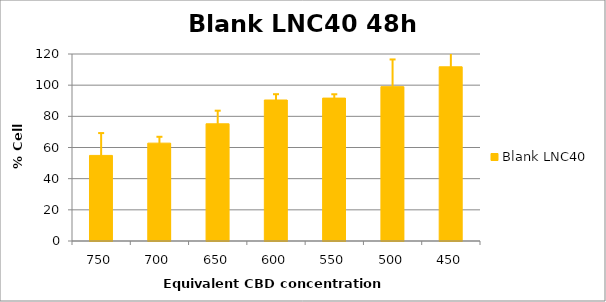
| Category | Blank LNC40 |
|---|---|
| 750.0 | 54.925 |
| 700.0 | 62.801 |
| 650.0 | 75.208 |
| 600.0 | 90.477 |
| 550.0 | 91.7 |
| 500.0 | 99.038 |
| 450.0 | 111.781 |